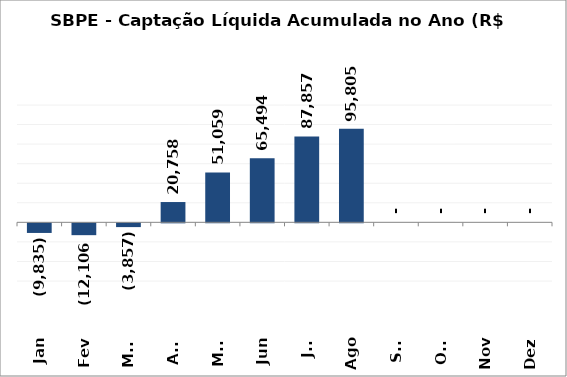
| Category | SBPE - Captação Líquida Acumulada no Ano (R$ Milhões) 2020 |
|---|---|
| Jan | -9835.145 |
| Fev | -12105.725 |
| Mar | -3856.755 |
| Abr | 20757.76 |
| Mai | 51058.921 |
| Jun | 65494.248 |
| Jul | 87857.435 |
| Ago | 95805.39 |
| Set | 0 |
| Out | 0 |
| Nov | 0 |
| Dez | 0 |